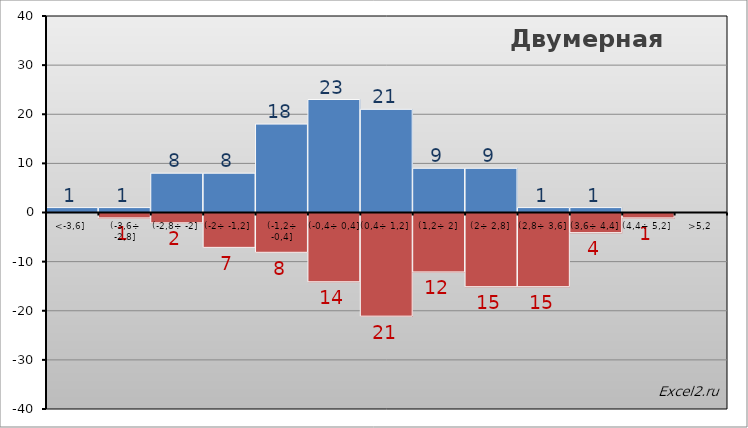
| Category | Частота1 | Частота2 |
|---|---|---|
| <-3,6] | 1 | 0 |
| (-3,6÷ -2,8] | 1 | -1 |
| (-2,8÷ -2] | 8 | -2 |
| (-2÷ -1,2] | 8 | -7 |
| (-1,2÷ -0,4] | 18 | -8 |
| (-0,4÷ 0,4] | 23 | -14 |
| (0,4÷ 1,2] | 21 | -21 |
| (1,2÷ 2] | 9 | -12 |
| (2÷ 2,8] | 9 | -15 |
| (2,8÷ 3,6] | 1 | -15 |
| (3,6÷ 4,4] | 1 | -4 |
| (4,4÷ 5,2] | 0 | -1 |
| >5,2 | 0 | 0 |